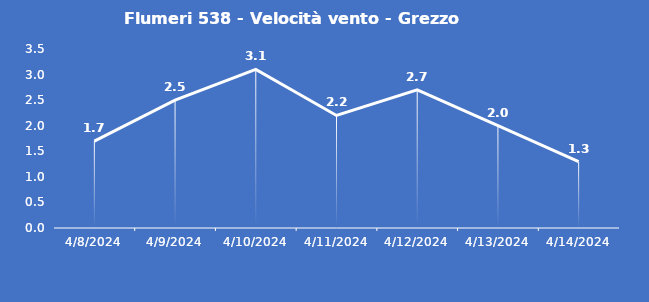
| Category | Flumeri 538 - Velocità vento - Grezzo (m/s) |
|---|---|
| 4/8/24 | 1.7 |
| 4/9/24 | 2.5 |
| 4/10/24 | 3.1 |
| 4/11/24 | 2.2 |
| 4/12/24 | 2.7 |
| 4/13/24 | 2 |
| 4/14/24 | 1.3 |